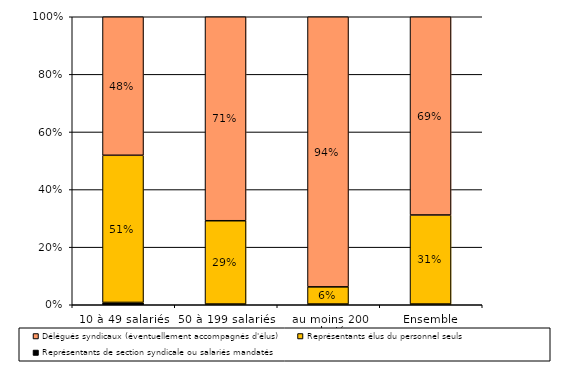
| Category | Représentants de section syndicale ou salariés mandatés | Représentants élus du personnel seuls | Délégués syndicaux (éventuellement accompagnés d'élus) |
|---|---|---|---|
| 10 à 49 salariés | 0.008 | 0.51 | 0.48 |
| 50 à 199 salariés | 0.002 | 0.29 | 0.71 |
| au moins 200 salariés | 0.002 | 0.06 | 0.94 |
| Ensemble | 0.002 | 0.31 | 0.69 |